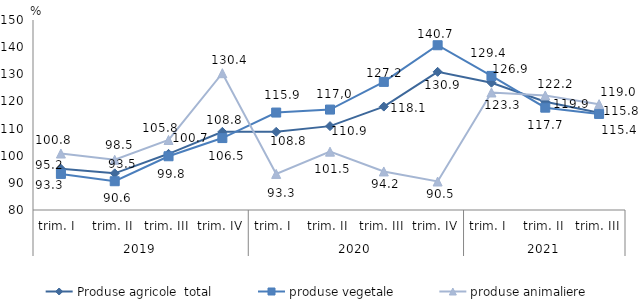
| Category | Produse agricole  total | produse vegetale | produse animaliere |
|---|---|---|---|
| 0 | 95.2 | 93.3 | 100.8 |
| 1 | 93.5 | 90.6 | 98.5 |
| 2 | 100.7 | 99.8 | 105.8 |
| 3 | 108.8 | 106.5 | 130.4 |
| 4 | 108.8 | 115.9 | 93.3 |
| 5 | 110.9 | 117 | 101.5 |
| 6 | 118.1 | 127.2 | 94.2 |
| 7 | 130.9 | 140.7 | 90.5 |
| 8 | 126.9 | 129.4 | 123.3 |
| 9 | 119.9 | 117.7 | 122.2 |
| 10 | 115.8 | 115.4 | 119 |